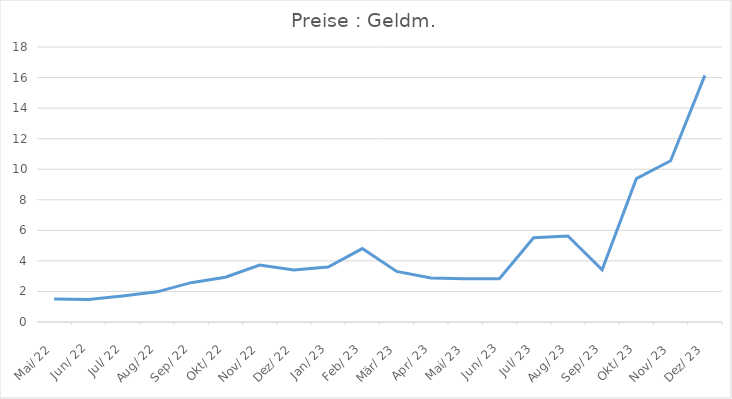
| Category | Preise : Geldm. |
|---|---|
| 1922-05-07 | 1.504 |
| 1922-06-06 12:00:00 | 1.475 |
| 1922-07-07 | 1.706 |
| 1922-08-06 12:00:00 | 1.974 |
| 1922-09-06 | 2.575 |
| 1922-10-06 12:00:00 | 2.927 |
| 1922-11-06 | 3.727 |
| 1922-12-06 12:00:00 | 3.401 |
| 1923-01-06 | 3.602 |
| 1923-02-05 12:00:00 | 4.805 |
| 1923-03-08 | 3.31 |
| 1923-04-07 12:00:00 | 2.876 |
| 1923-05-08 | 2.838 |
| 1923-06-07 12:00:00 | 2.828 |
| 1923-07-08 | 5.515 |
| 1923-08-07 12:00:00 | 5.634 |
| 1923-09-07 | 3.414 |
| 1923-10-07 12:00:00 | 9.386 |
| 1923-11-07 | 10.551 |
| 1923-12-07 12:00:00 | 16.145 |